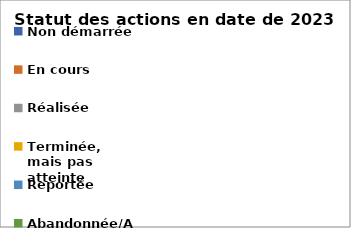
| Category | 2023 | 2024 | 2025 |
|---|---|---|---|
| Non démarrée | 0 | 0 | 0 |
| En cours | 0 | 0 | 0 |
| Réalisée | 0 | 0 | 0 |
| Terminée, mais pas atteinte | 0 | 0 | 0 |
| Reportée | 0 | 0 | 0 |
| Abandonnée/Annulée | 0 | 0 | 0 |